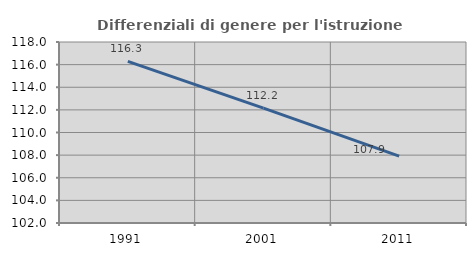
| Category | Differenziali di genere per l'istruzione superiore |
|---|---|
| 1991.0 | 116.28 |
| 2001.0 | 112.155 |
| 2011.0 | 107.916 |